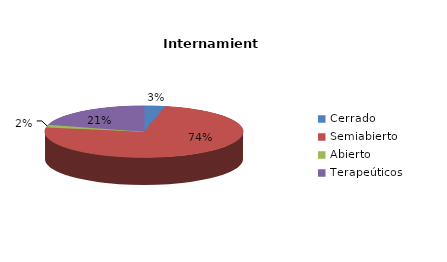
| Category | Series 0 |
|---|---|
| Cerrado | 2 |
| Semiabierto | 43 |
| Abierto | 1 |
| Terapeúticos | 12 |